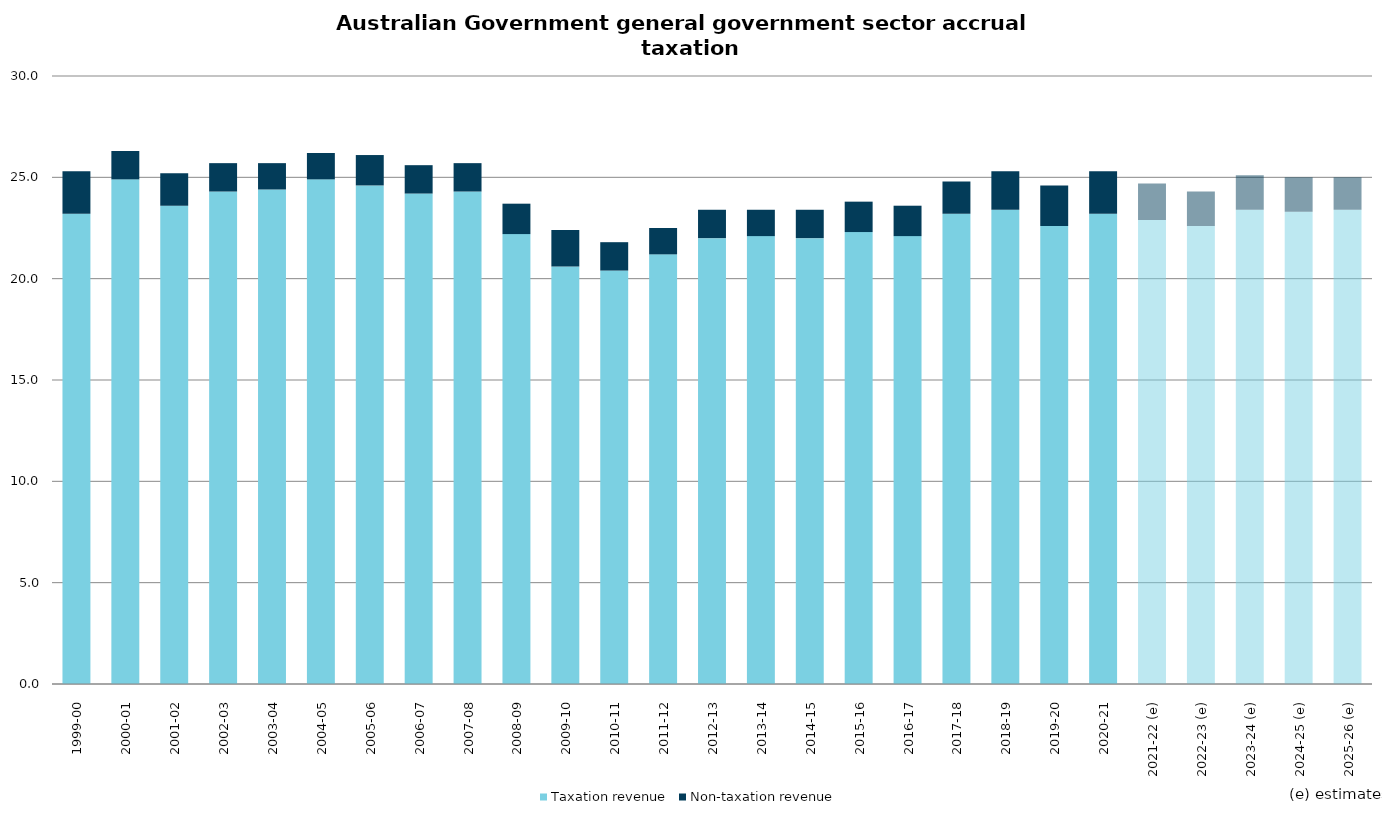
| Category | Taxation revenue | Non-taxation revenue |
|---|---|---|
| 1999-00 | 23.2 | 2.1 |
| 2000-01 | 24.9 | 1.4 |
| 2001-02 | 23.6 | 1.6 |
| 2002-03 | 24.3 | 1.4 |
| 2003-04 | 24.4 | 1.3 |
| 2004-05 | 24.9 | 1.3 |
| 2005-06 | 24.6 | 1.5 |
| 2006-07 | 24.2 | 1.4 |
| 2007-08 | 24.3 | 1.4 |
| 2008-09 | 22.2 | 1.5 |
| 2009-10 | 20.6 | 1.8 |
| 2010-11 | 20.4 | 1.4 |
| 2011-12 | 21.2 | 1.3 |
| 2012-13 | 22 | 1.4 |
| 2013-14 | 22.1 | 1.3 |
| 2014-15 | 22 | 1.4 |
| 2015-16 | 22.3 | 1.5 |
| 2016-17 | 22.1 | 1.5 |
| 2017-18 | 23.2 | 1.6 |
| 2018-19 | 23.4 | 1.9 |
| 2019-20 | 22.6 | 2 |
| 2020-21 | 23.2 | 2.1 |
| 2021-22 (e) | 22.9 | 1.8 |
| 2022-23 (e) | 22.6 | 1.7 |
| 2023-24 (e) | 23.4 | 1.7 |
| 2024-25 (e) | 23.3 | 1.7 |
| 2025-26 (e) | 23.4 | 1.6 |